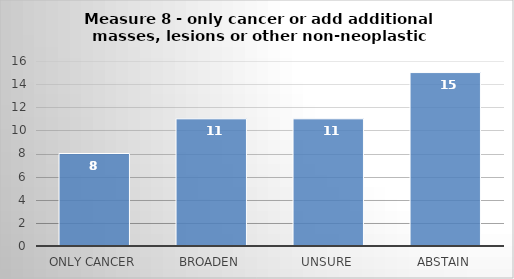
| Category | Series 0 |
|---|---|
| Only cancer | 8 |
| Broaden | 11 |
| Unsure | 11 |
| Abstain | 15 |